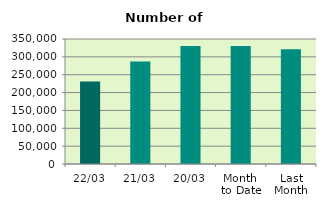
| Category | Series 0 |
|---|---|
| 22/03 | 230962 |
| 21/03 | 287062 |
| 20/03 | 330536 |
| Month 
to Date | 330527.125 |
| Last
Month | 321374.6 |